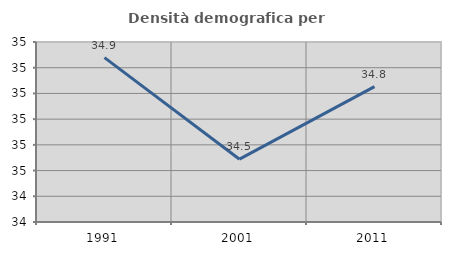
| Category | Densità demografica |
|---|---|
| 1991.0 | 34.939 |
| 2001.0 | 34.544 |
| 2011.0 | 34.826 |